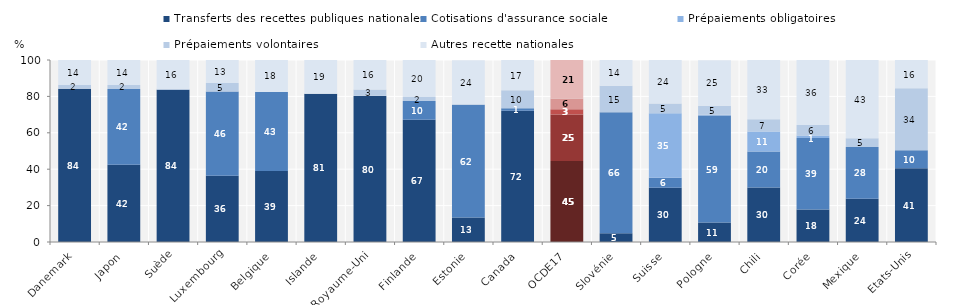
| Category | Transferts des recettes publiques nationales | Cotisations d'assurance sociale | Prépaiements obligatoires | Prépaiements volontaires | Autres recette nationales |
|---|---|---|---|---|---|
| Danemark | 84.143 | 0 | 0 | 2.068 | 13.789 |
| Japon | 42.411 | 41.707 | 0 | 2.196 | 13.686 |
| Suède | 83.664 | 0 | 0 | 0.592 | 15.745 |
| Luxembourg | 36.468 | 46.207 | 0 | 4.662 | 12.657 |
| Belgique | 39.043 | 43.362 | 0 | 0.014 | 17.582 |
| Islande | 81.475 | 0 | 0 | 0 | 18.525 |
| Royaume-Uni | 80.212 | 0 | 0.14 | 3.42 | 16.218 |
| Finlande | 67.224 | 10.188 | 0 | 2.272 | 20.314 |
| Estonie | 13.488 | 61.874 | 0 | 0.292 | 24.141 |
| Canada | 72.101 | 1.449 | 0 | 9.893 | 16.557 |
| OCDE17 | 44.566 | 25.459 | 2.852 | 5.99 | 21.11 |
| Slovénie | 4.811 | 66.485 | 0 | 14.503 | 14.201 |
| Suisse | 29.782 | 5.51 | 35.435 | 5.383 | 23.89 |
| Pologne | 10.698 | 58.779 | 0.408 | 5.039 | 24.886 |
| Chili | 29.927 | 19.753 | 11.101 | 6.668 | 32.55 |
| Corée | 17.801 | 39.324 | 1.406 | 5.791 | 35.678 |
| Mexique | 23.813 | 28.356 | 0 | 4.892 | 42.939 |
| Etats-Unis | 40.555 | 9.801 | 0 | 34.137 | 15.507 |